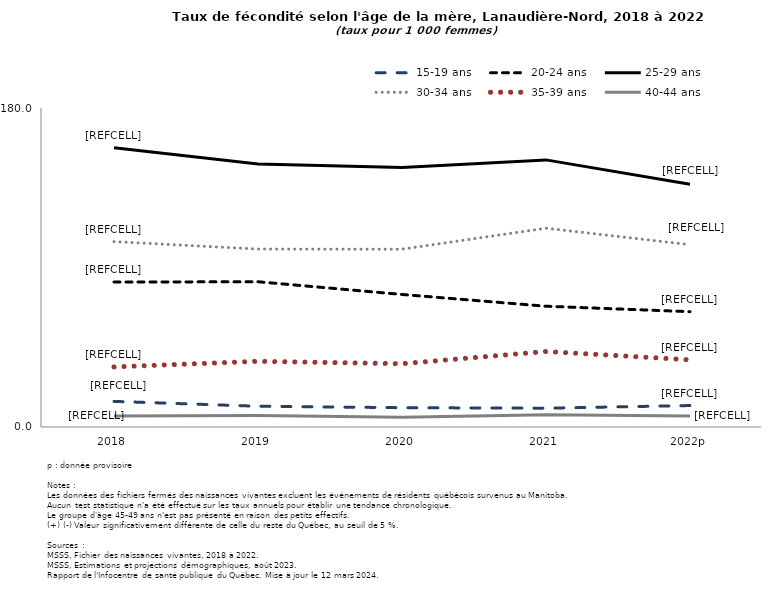
| Category | 15-19 ans | 20-24 ans | 25-29 ans | 30-34 ans | 35-39 ans | 40-44 ans |
|---|---|---|---|---|---|---|
| 2018 | 14.457 | 81.782 | 157.506 | 104.6 | 33.89 | 6.221 |
| 2019 | 11.703 | 81.964 | 148.407 | 100.396 | 37.078 | 6.545 |
| 2020 | 10.892 | 74.785 | 146.494 | 100.331 | 35.703 | 5.518 |
| 2021 | 10.612 | 68.146 | 150.724 | 112.181 | 42.608 | 6.98 |
| 2022p | 12.104 | 65.071 | 136.935 | 102.872 | 37.918 | 6.211 |